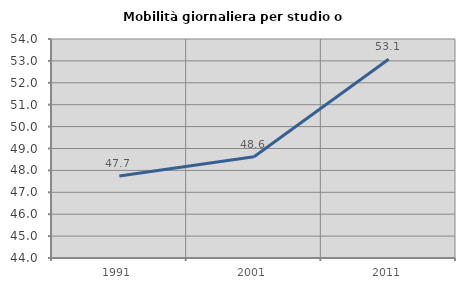
| Category | Mobilità giornaliera per studio o lavoro |
|---|---|
| 1991.0 | 47.743 |
| 2001.0 | 48.626 |
| 2011.0 | 53.074 |